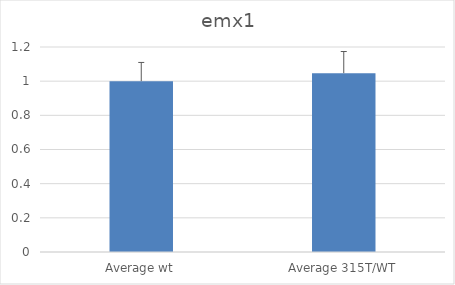
| Category |  emx1 |
|---|---|
| Average wt | 1 |
| Average 315T/WT | 1.047 |